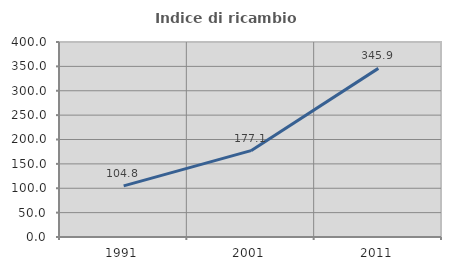
| Category | Indice di ricambio occupazionale  |
|---|---|
| 1991.0 | 104.828 |
| 2001.0 | 177.119 |
| 2011.0 | 345.902 |